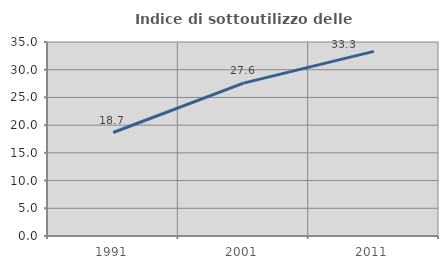
| Category | Indice di sottoutilizzo delle abitazioni  |
|---|---|
| 1991.0 | 18.669 |
| 2001.0 | 27.581 |
| 2011.0 | 33.308 |